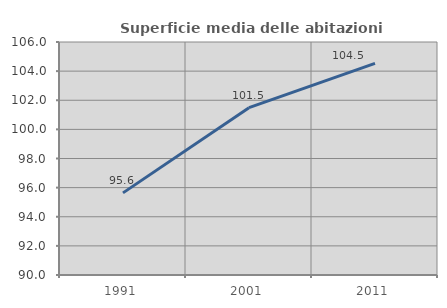
| Category | Superficie media delle abitazioni occupate |
|---|---|
| 1991.0 | 95.64 |
| 2001.0 | 101.492 |
| 2011.0 | 104.532 |